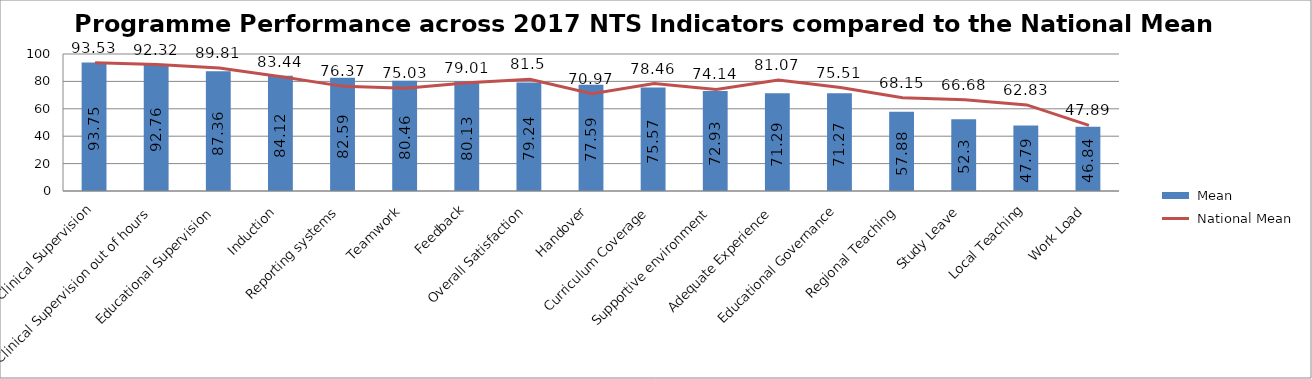
| Category |  Mean |
|---|---|
| Clinical Supervision | 93.75 |
| Clinical Supervision out of hours | 92.76 |
| Educational Supervision | 87.36 |
| Induction | 84.12 |
| Reporting systems | 82.59 |
| Teamwork | 80.46 |
| Feedback | 80.13 |
| Overall Satisfaction | 79.24 |
| Handover | 77.59 |
| Curriculum Coverage | 75.57 |
| Supportive environment | 72.93 |
| Adequate Experience | 71.29 |
| Educational Governance | 71.27 |
| Regional Teaching | 57.88 |
| Study Leave | 52.3 |
| Local Teaching | 47.79 |
| Work Load | 46.84 |